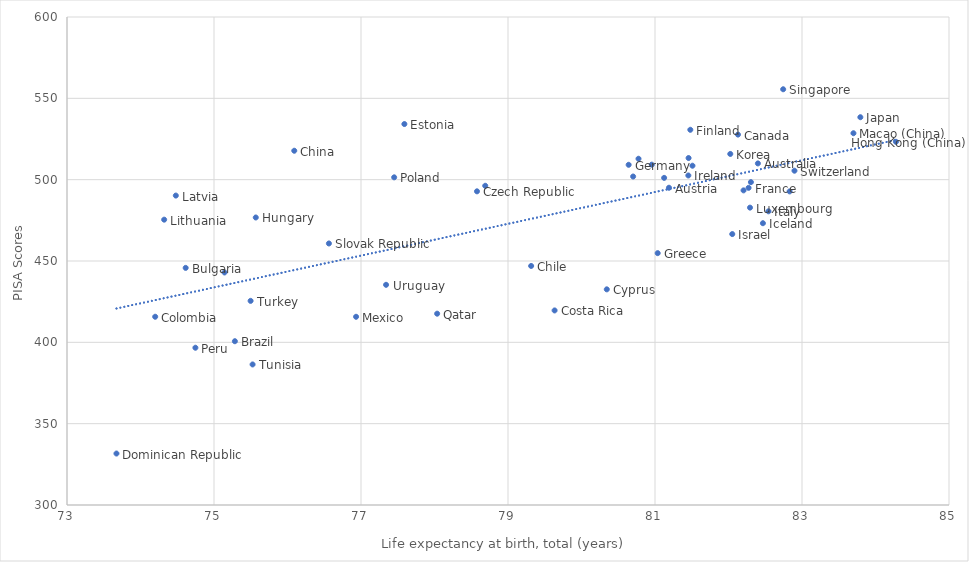
| Category | Series 0 |
|---|---|
| 82.4 | 509.994 |
| 81.19024390243904 | 495.037 |
| 75.284 | 400.682 |
| 74.61463414634147 | 445.772 |
| 82.12902439024391 | 527.705 |
| 79.315 | 446.956 |
| 76.092 | 517.779 |
| 74.2 | 415.729 |
| 79.634 | 419.608 |
| 80.344 | 432.577 |
| 78.5780487804878 | 492.83 |
| 80.70243902439024 | 501.937 |
| 73.673 | 331.639 |
| 77.59024390243903 | 534.194 |
| 81.48048780487807 | 530.661 |
| 82.27317073170734 | 494.978 |
| 80.64146341463415 | 509.141 |
| 81.03658536585367 | 454.829 |
| 84.27804878048782 | 523.277 |
| 75.56829268292685 | 476.748 |
| 82.46829268292684 | 473.23 |
| 81.45365853658538 | 502.575 |
| 82.05121951219512 | 466.553 |
| 82.5439024390244 | 480.547 |
| 83.7939024390244 | 538.395 |
| 82.02439024390245 | 515.81 |
| 74.48048780487805 | 490.225 |
| 74.32195121951221 | 475.409 |
| 82.29268292682927 | 482.806 |
| 83.7 | 528.55 |
| 75.143 | 442.948 |
| 76.933 | 415.71 |
| 81.509756097561 | 508.575 |
| 81.4568292682927 | 513.304 |
| 82.30487804878051 | 498.481 |
| 74.747 | 396.684 |
| 77.45121951219512 | 501.435 |
| 81.12439024390245 | 501.1 |
| 78.036 | 417.611 |
| 82.7439024390244 | 555.575 |
| 76.56341463414634 | 460.775 |
| 80.77560975609757 | 512.864 |
| 82.83170731707318 | 492.786 |
| 82.2048780487805 | 493.422 |
| 82.89756097560976 | 505.506 |
| 75.525 | 386.403 |
| 75.498 | 425.49 |
| 80.95609756097562 | 509.222 |
| 78.69024390243904 | 496.242 |
| 77.341 | 435.363 |